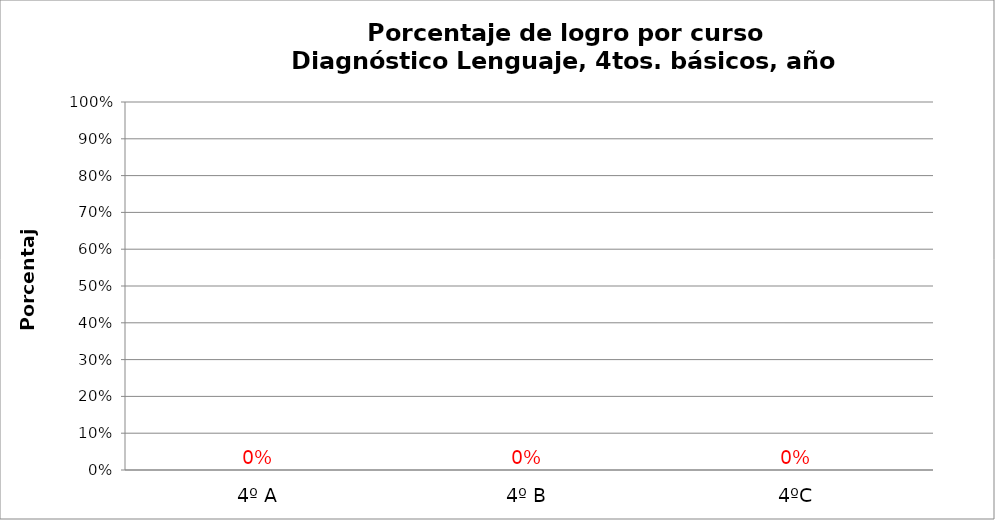
| Category | Series 0 |
|---|---|
| 4º A | 0 |
| 4º B | 0 |
| 4ºC | 0 |